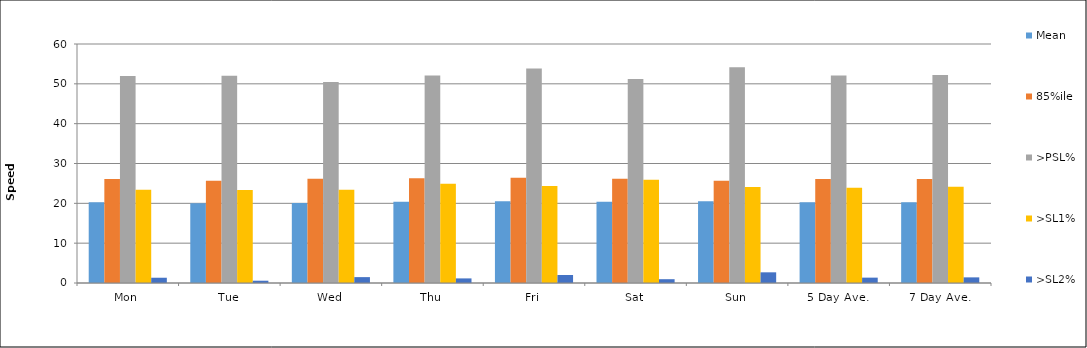
| Category | Mean | 85%ile | >PSL% | >SL1% | >SL2% |
|---|---|---|---|---|---|
| Mon | 20.3 | 26.1 | 51.94 | 23.42 | 1.322 |
| Tue | 20 | 25.7 | 52.01 | 23.33 | 0.574 |
| Wed | 20.1 | 26.2 | 50.49 | 23.43 | 1.476 |
| Thu | 20.4 | 26.3 | 52.12 | 24.9 | 1.154 |
| Fri | 20.5 | 26.4 | 53.88 | 24.35 | 2.013 |
| Sat | 20.4 | 26.2 | 51.19 | 25.89 | 0.955 |
| Sun | 20.5 | 25.7 | 54.16 | 24.13 | 2.681 |
| 5 Day Ave. | 20.3 | 26.1 | 52.065 | 23.919 | 1.345 |
| 7 Day Ave. | 20.3 | 26.1 | 52.21 | 24.16 | 1.414 |